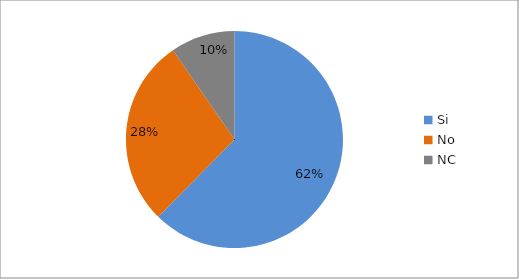
| Category | Series 0 | Series 1 | Series 2 |
|---|---|---|---|
| Si |  |  | 234 |
| No |  |  | 105 |
| NC |  |  | 36 |